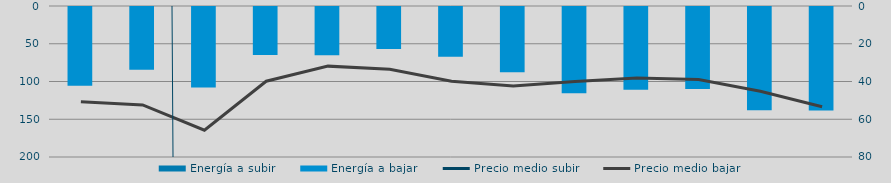
| Category | Energía a subir | Energía a bajar |
|---|---|---|
| D |  | 105775.107 |
| E |  | 84597.136 |
| F |  | 108041.453 |
| M |  | 65058.027 |
| A |  | 65080.662 |
| M |  | 56832.525 |
| J |  | 67245.511 |
| J |  | 87837.741 |
| A |  | 115472.265 |
| S |  | 110945.08 |
| O |  | 109933.033 |
| N |  | 138127.981 |
| D |  | 138345.883 |